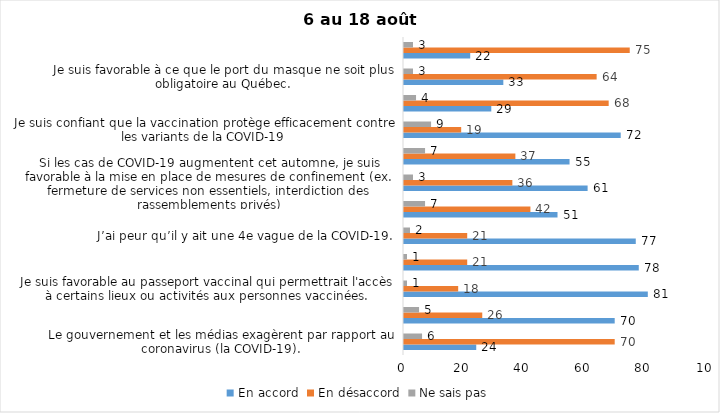
| Category | En accord | En désaccord | Ne sais pas |
|---|---|---|---|
| Le gouvernement et les médias exagèrent par rapport au coronavirus (la COVID-19). | 24 | 70 | 6 |
| J’ai peur que le système de santé soit débordé par les cas de COVID-19 suite au "déconfinement" | 70 | 26 | 5 |
| Je suis favorable au passeport vaccinal qui permettrait l'accès à certains lieux ou activités aux personnes vaccinées. | 81 | 18 | 1 |
| Malgré la levée des mesures de confinement, je préfère limiter mes contacts avec d’autres personnes (par ex., en évitant les activités sociales et de groupes) | 78 | 21 | 1 |
| J’ai peur qu’il y ait une 4e vague de la COVID-19. | 77 | 21 | 2 |
| Dans les régions en zone verte, le risque d’attraper la COVID-19 est minime. | 51 | 42 | 7 |
| Si les cas de COVID-19 augmentent cet automne, je suis favorable à la mise en place de mesures de confinement (ex. fermeture de services non essentiels, interdiction des rassemblements privés) | 61 | 36 | 3 |
| Je suis inquiet de contracter le variant Delta de la Covid-19 | 55 | 37 | 7 |
| Je suis confiant que la vaccination protège efficacement contre les variants de la COVID-19 | 72 | 19 | 9 |
| En raison de la baisse des cas de COID-19 je pense que le gouvernement du Québec devrait mettre fin à l’état d’urgence sanitaire | 29 | 68 | 4 |
| Je suis favorable à ce que le port du masque ne soit plus obligatoire au Québec. | 33 | 64 | 3 |
| Étant donné la progression de la vaccination, je pense qu’il est moins important de suivre les mesures de prévention. | 22 | 75 | 3 |